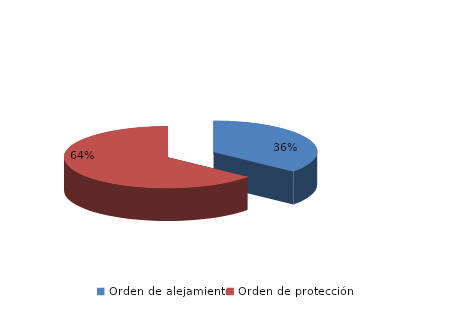
| Category | Series 0 |
|---|---|
| Orden de alejamiento | 207 |
| Orden de protección | 368 |